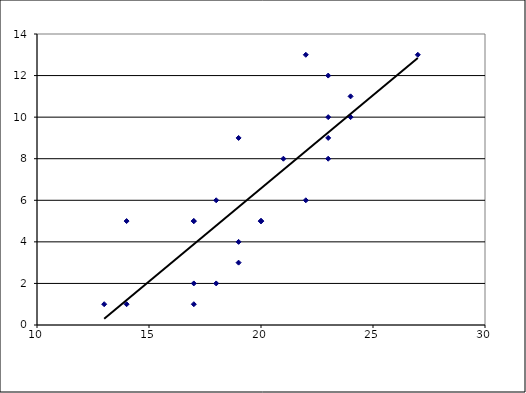
| Category | Series 0 |
|---|---|
| 23.0 | 12 |
| 23.0 | 9 |
| 20.0 | 5 |
| 14.0 | 1 |
| 23.0 | 8 |
| 24.0 | 10 |
| 19.0 | 4 |
| 14.0 | 5 |
| 13.0 | 1 |
| 20.0 | 5 |
| 21.0 | 8 |
| 22.0 | 13 |
| 27.0 | 13 |
| 19.0 | 9 |
| 19.0 | 3 |
| 17.0 | 2 |
| 20.0 | 5 |
| 17.0 | 1 |
| 22.0 | 6 |
| 18.0 | 6 |
| 24.0 | 11 |
| 17.0 | 5 |
| 23.0 | 10 |
| 17.0 | 5 |
| 18.0 | 2 |